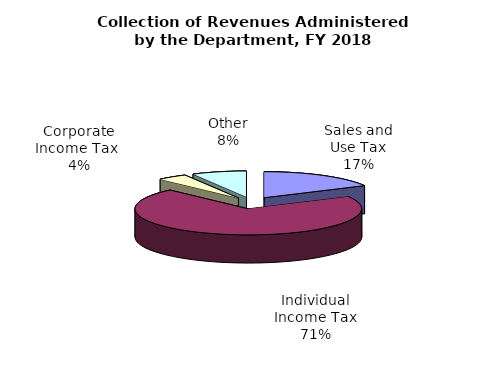
| Category | Series 0 |
|---|---|
| Sales and Use Tax | 3458249000 |
| Individual Income Tax | 14105766000 |
| Corporate Income Tax  | 861897000 |
| Other | 1563180000 |